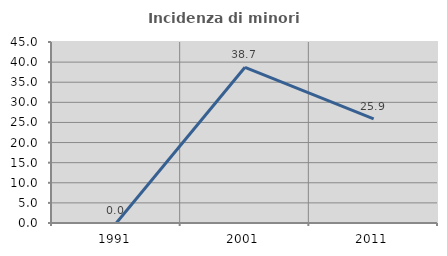
| Category | Incidenza di minori stranieri |
|---|---|
| 1991.0 | 0 |
| 2001.0 | 38.71 |
| 2011.0 | 25.882 |